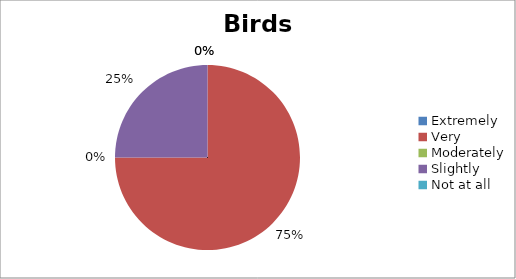
| Category | Birds |
|---|---|
| Extremely | 0 |
| Very | 3 |
| Moderately | 0 |
| Slightly | 1 |
| Not at all | 0 |